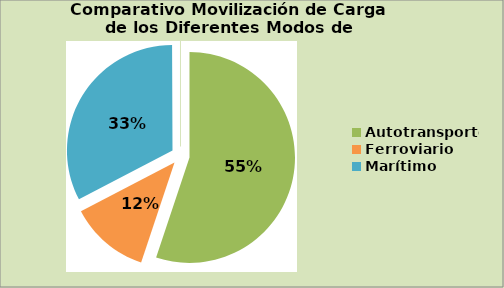
| Category | Series 0 |
|---|---|
| Autotransporte | 485.502 |
| Ferroviario | 107.69 |
| Marítimo | 286.976 |
| Aéreo | 0.568 |